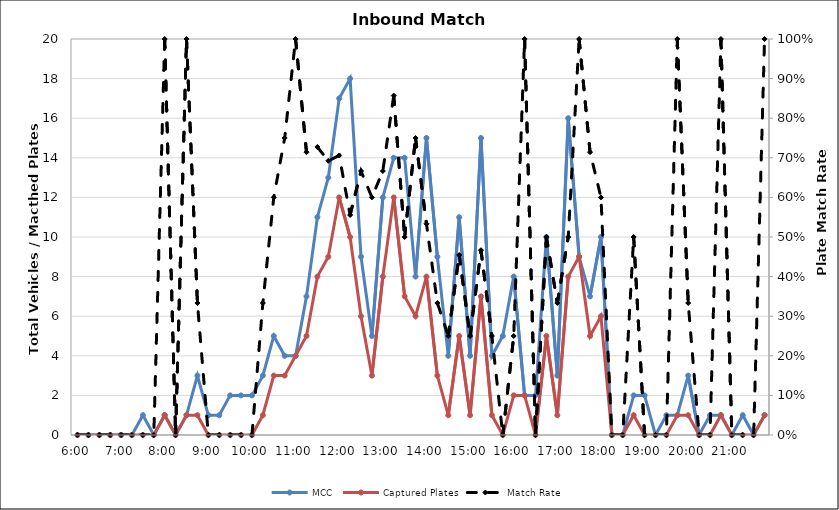
| Category | MCC | Captured Plates |
|---|---|---|
| 0.25 | 0 | 0 |
| 0.260416666666667 | 0 | 0 |
| 0.270833333333333 | 0 | 0 |
| 0.28125 | 0 | 0 |
| 0.291666666666667 | 0 | 0 |
| 0.302083333333333 | 0 | 0 |
| 0.3125 | 1 | 0 |
| 0.322916666666667 | 0 | 0 |
| 0.333333333333333 | 1 | 1 |
| 0.34375 | 0 | 0 |
| 0.354166666666667 | 1 | 1 |
| 0.364583333333333 | 3 | 1 |
| 0.375 | 1 | 0 |
| 0.385416666666667 | 1 | 0 |
| 0.395833333333333 | 2 | 0 |
| 0.40625 | 2 | 0 |
| 0.416666666666667 | 2 | 0 |
| 0.427083333333333 | 3 | 1 |
| 0.4375 | 5 | 3 |
| 0.447916666666667 | 4 | 3 |
| 0.458333333333333 | 4 | 4 |
| 0.46875 | 7 | 5 |
| 0.479166666666667 | 11 | 8 |
| 0.489583333333333 | 13 | 9 |
| 0.5 | 17 | 12 |
| 0.510416666666667 | 18 | 10 |
| 0.520833333333333 | 9 | 6 |
| 0.53125 | 5 | 3 |
| 0.541666666666667 | 12 | 8 |
| 0.552083333333333 | 14 | 12 |
| 0.5625 | 14 | 7 |
| 0.572916666666667 | 8 | 6 |
| 0.583333333333333 | 15 | 8 |
| 0.59375 | 9 | 3 |
| 0.604166666666667 | 4 | 1 |
| 0.614583333333333 | 11 | 5 |
| 0.625 | 4 | 1 |
| 0.635416666666667 | 15 | 7 |
| 0.645833333333333 | 4 | 1 |
| 0.65625 | 5 | 0 |
| 0.666666666666667 | 8 | 2 |
| 0.677083333333333 | 2 | 2 |
| 0.6875 | 2 | 0 |
| 0.697916666666667 | 10 | 5 |
| 0.708333333333333 | 3 | 1 |
| 0.71875 | 16 | 8 |
| 0.729166666666667 | 9 | 9 |
| 0.739583333333333 | 7 | 5 |
| 0.75 | 10 | 6 |
| 0.760416666666667 | 0 | 0 |
| 0.770833333333333 | 0 | 0 |
| 0.78125 | 2 | 1 |
| 0.791666666666667 | 2 | 0 |
| 0.802083333333333 | 0 | 0 |
| 0.8125 | 1 | 0 |
| 0.822916666666667 | 1 | 1 |
| 0.833333333333333 | 3 | 1 |
| 0.84375 | 0 | 0 |
| 0.854166666666667 | 1 | 0 |
| 0.864583333333333 | 1 | 1 |
| 0.875 | 0 | 0 |
| 0.885416666666667 | 1 | 0 |
| 0.895833333333333 | 0 | 0 |
| 0.90625 | 1 | 1 |